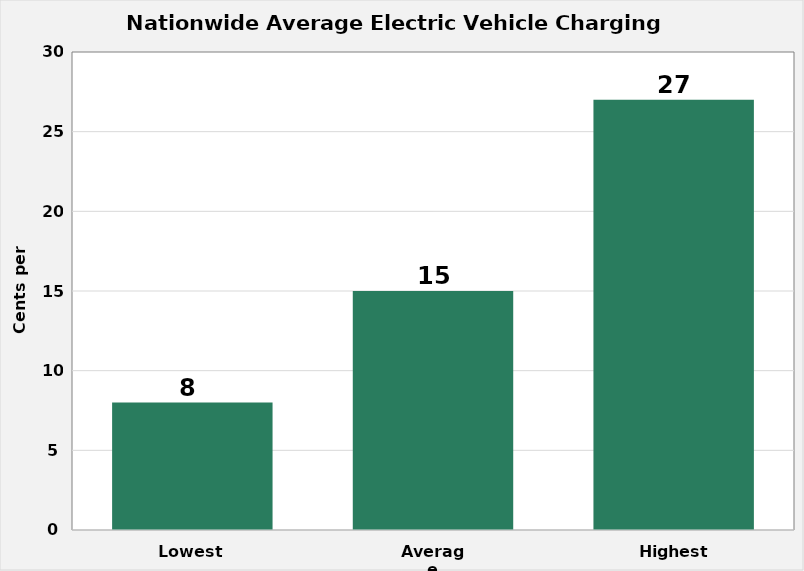
| Category | Series 0 |
|---|---|
| Lowest  | 8 |
| Average | 15 |
| Highest | 27 |